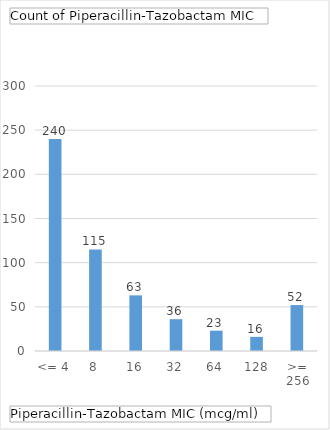
| Category | Total |
|---|---|
| <= 4 | 240 |
| 8 | 115 |
| 16 | 63 |
| 32 | 36 |
| 64 | 23 |
| 128 | 16 |
| >= 256 | 52 |